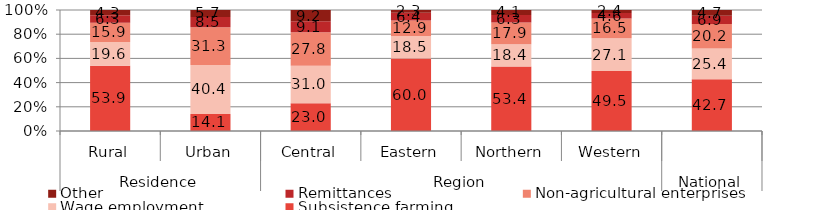
| Category | Subsistence farming | Wage employment | Non-agricultural enterprises | Remittances | Other |
|---|---|---|---|---|---|
| 0 | 53.9 | 19.6 | 15.9 | 6.3 | 4.3 |
| 1 | 14.1 | 40.4 | 31.3 | 8.5 | 5.7 |
| 2 | 23 | 31 | 27.75 | 9.1 | 9.2 |
| 3 | 59.95 | 18.5 | 12.875 | 6.35 | 2.325 |
| 4 | 53.4 | 18.35 | 17.9 | 6.25 | 4.125 |
| 5 | 49.5 | 27.075 | 16.45 | 4.55 | 2.425 |
| 6 | 42.7 | 25.4 | 20.2 | 6.9 | 4.7 |